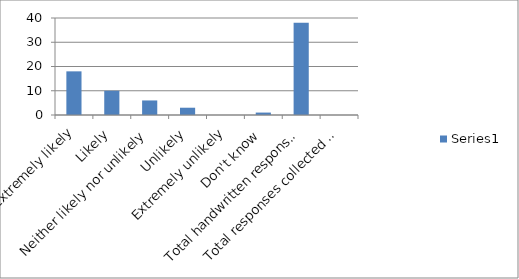
| Category | Series 0 |
|---|---|
| Extremely likely | 18 |
| Likely | 10 |
| Neither likely nor unlikely | 6 |
| Unlikely | 3 |
| Extremely unlikely | 0 |
| Don't know | 1 |
| Total handwritten responses | 38 |
| Total responses collected from other methods | 0 |